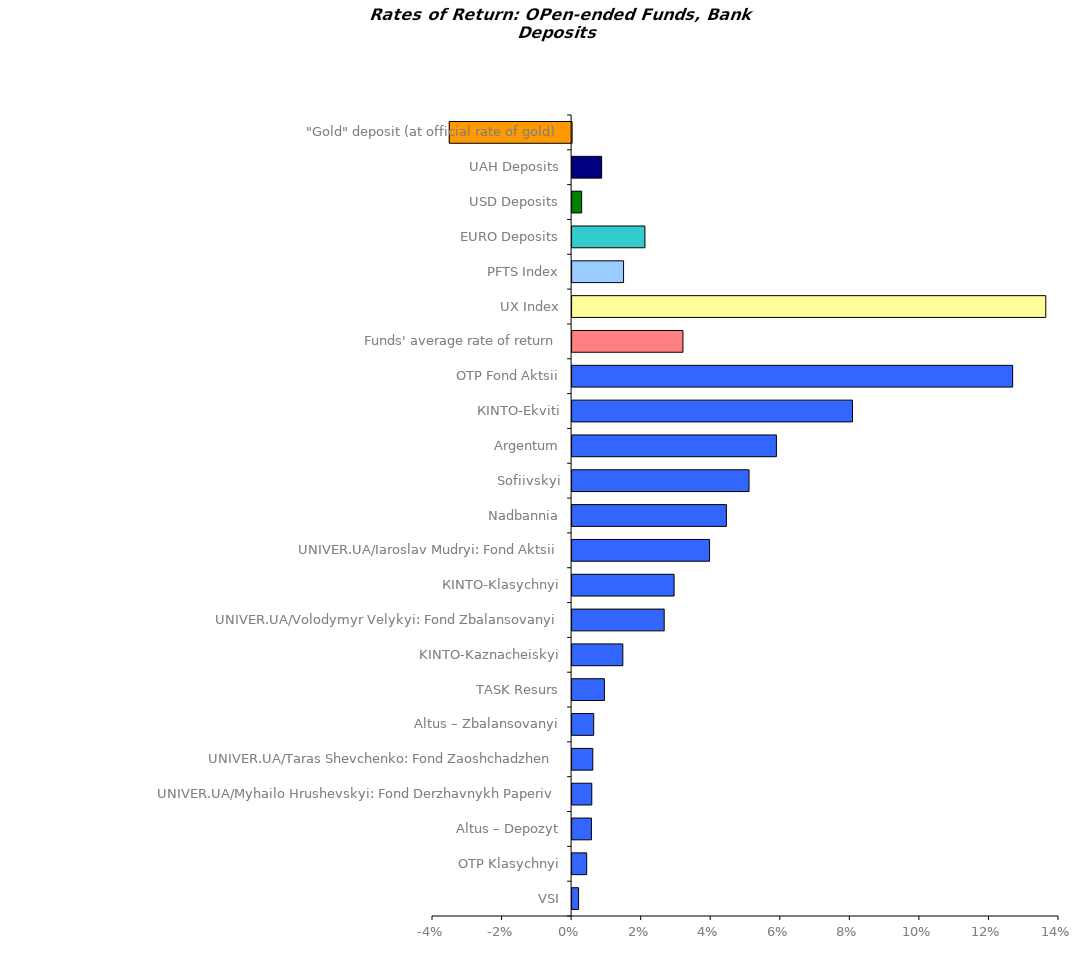
| Category | Series 0 |
|---|---|
| VSI | 0.002 |
| OTP Klasychnyi | 0.004 |
| Altus – Depozyt | 0.006 |
| UNIVER.UA/Myhailo Hrushevskyi: Fond Derzhavnykh Paperiv | 0.006 |
| UNIVER.UA/Taras Shevchenko: Fond Zaoshchadzhen | 0.006 |
| Altus – Zbalansovanyi | 0.006 |
| ТАSK Resurs | 0.009 |
| KINTO-Kaznacheiskyi | 0.015 |
| UNIVER.UA/Volodymyr Velykyi: Fond Zbalansovanyi | 0.026 |
| КІNТО-Klasychnyi | 0.029 |
| UNIVER.UA/Iaroslav Mudryi: Fond Aktsii | 0.04 |
| Nadbannia | 0.044 |
| Sofiivskyi | 0.051 |
| Argentum | 0.059 |
| КІNTO-Ekviti | 0.081 |
| OTP Fond Aktsii | 0.127 |
| Funds' average rate of return | 0.032 |
| UX Index | 0.136 |
| PFTS Index | 0.015 |
| EURO Deposits | 0.021 |
| USD Deposits | 0.003 |
| UAH Deposits | 0.008 |
| "Gold" deposit (at official rate of gold) | -0.035 |